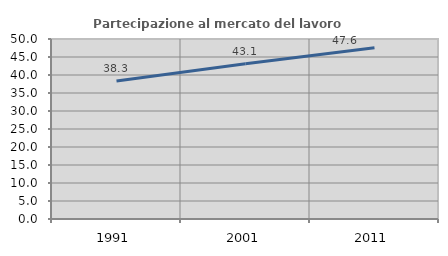
| Category | Partecipazione al mercato del lavoro  femminile |
|---|---|
| 1991.0 | 38.326 |
| 2001.0 | 43.099 |
| 2011.0 | 47.567 |